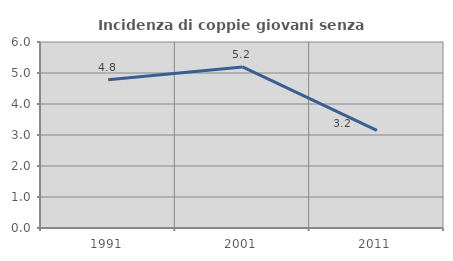
| Category | Incidenza di coppie giovani senza figli |
|---|---|
| 1991.0 | 4.783 |
| 2001.0 | 5.196 |
| 2011.0 | 3.15 |